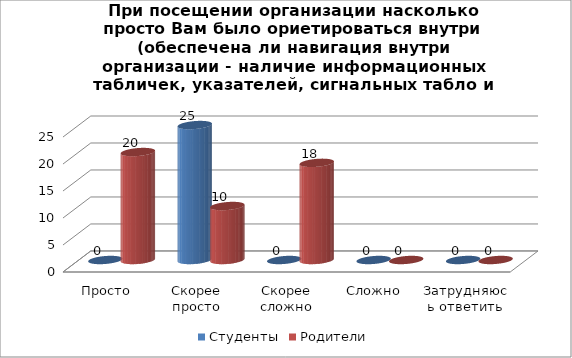
| Category | Студенты | Родители |
|---|---|---|
| Просто | 0 | 20 |
| Скорее просто | 25 | 10 |
| Скорее сложно | 0 | 18 |
| Сложно | 0 | 0 |
| Затрудняюсь ответить | 0 | 0 |